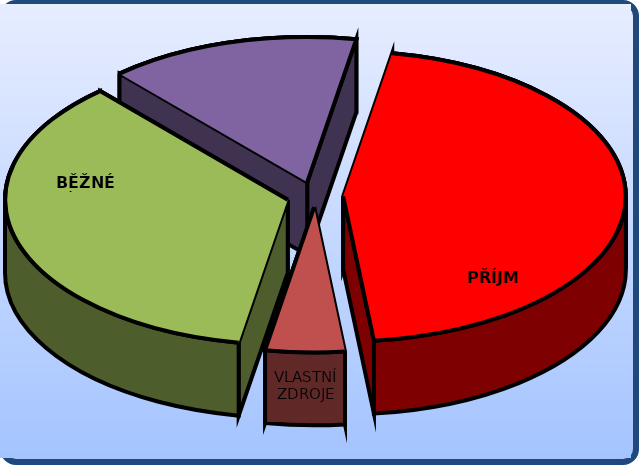
| Category | Series 0 |
|---|---|
| PŘÍJMY | 1046315 |
| FINANCOVÁNÍ | 103839.912 |
| BĚŽNÉ VÝDAJE | 820474.652 |
| KAPITÁLOVÉ VÝDAJE | 329680.26 |